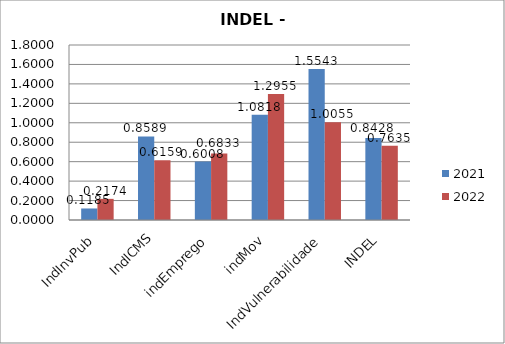
| Category | 2021 | 2022 |
|---|---|---|
| IndInvPub | 0.119 | 0.217 |
| IndICMS | 0.859 | 0.616 |
| indEmprego | 0.601 | 0.683 |
| indMov | 1.082 | 1.295 |
| IndVulnerabilidade | 1.554 | 1.005 |
| INDEL | 0.843 | 0.764 |